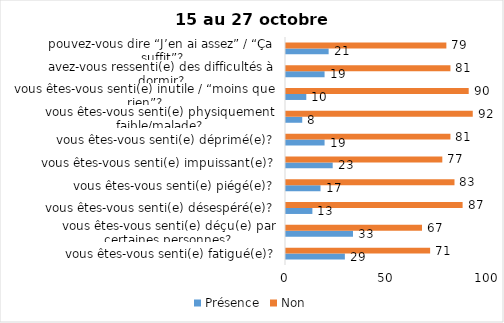
| Category | Présence | Non |
|---|---|---|
| vous êtes-vous senti(e) fatigué(e)? | 29 | 71 |
| vous êtes-vous senti(e) déçu(e) par certaines personnes? | 33 | 67 |
| vous êtes-vous senti(e) désespéré(e)? | 13 | 87 |
| vous êtes-vous senti(e) piégé(e)? | 17 | 83 |
| vous êtes-vous senti(e) impuissant(e)? | 23 | 77 |
| vous êtes-vous senti(e) déprimé(e)? | 19 | 81 |
| vous êtes-vous senti(e) physiquement faible/malade? | 8 | 92 |
| vous êtes-vous senti(e) inutile / “moins que rien”? | 10 | 90 |
| avez-vous ressenti(e) des difficultés à dormir? | 19 | 81 |
| pouvez-vous dire “J’en ai assez” / “Ça suffit”? | 21 | 79 |